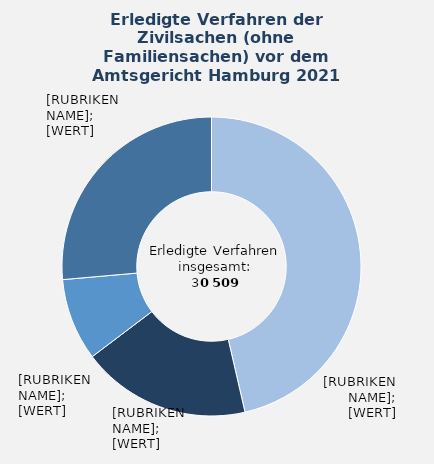
| Category | in Prozent |
|---|---|
| Sonstiger Verfahrensgegenstand | 46.4 |
| Wohnungsmietsachen | 18.3 |
| Verkehrsunfallsachen | 8.9 |
| Übrige Sachgebiete¹ | 26.4 |